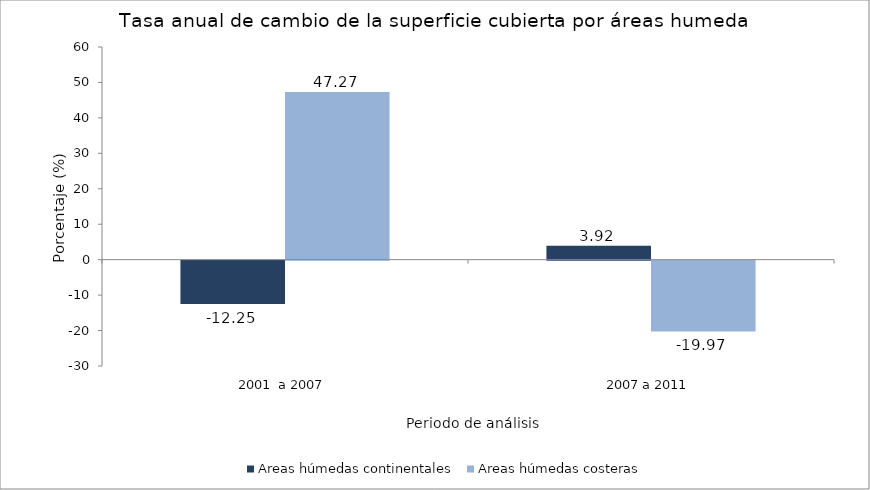
| Category | Areas húmedas continentales | Areas húmedas costeras |
|---|---|---|
| 2001  a 2007 | -12.246 | 47.274 |
| 2007 a 2011 | 3.919 | -19.966 |